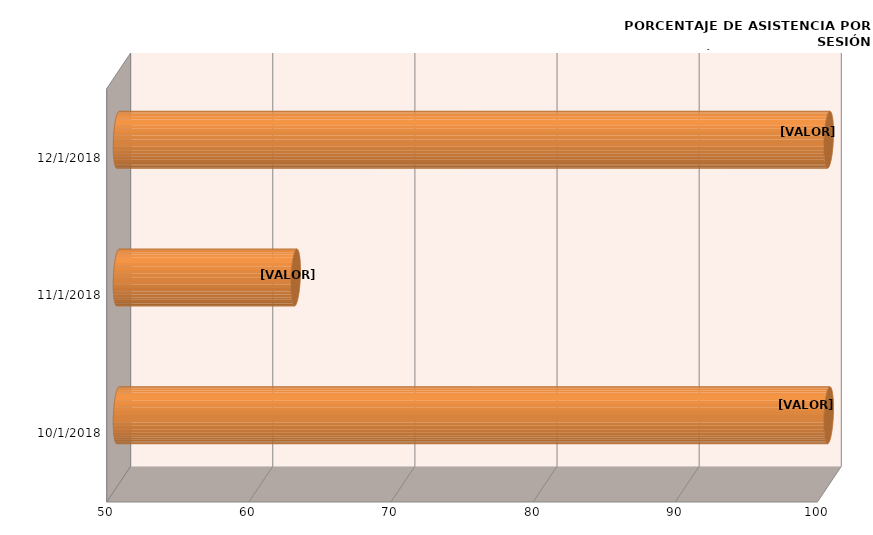
| Category | Series 0 |
|---|---|
| 10/15/18 | 100 |
| 11/20/18 | 62.5 |
| 12/10/18 | 100 |